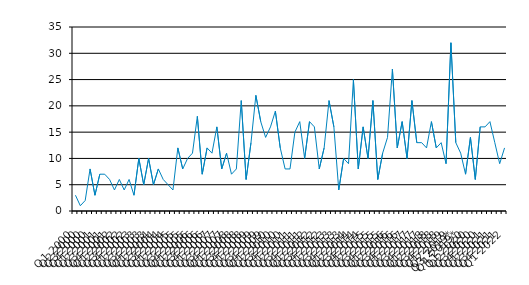
| Category | Series 0 |
|---|---|
| Q1 2000 | 3 |
| Q2 2000 | 1 |
| Q3 2000 | 2 |
| Q4 2000 | 8 |
| Q1 2001 | 3 |
| Q2 2001 | 7 |
| Q3 2001 | 7 |
| Q4 2001 | 6 |
| Q1 2002 | 4 |
| Q2 2002 | 6 |
| Q3 2002 | 4 |
| Q4 2002 | 6 |
| Q1 2003 | 3 |
| Q2 2003 | 10 |
| Q3 2003 | 5 |
| Q4 2003 | 10 |
| Q1 2004 | 5 |
| Q2 2004 | 8 |
| Q3 2004 | 6 |
| Q4 2004 | 5 |
| Q1 2005 | 4 |
| Q2 2005 | 12 |
| Q3 2005 | 8 |
| Q4 2005 | 10 |
| Q1 2006 | 11 |
| Q2 2006 | 18 |
| Q3 2006 | 7 |
| Q4 2006 | 12 |
| Q1 2007 | 11 |
| Q2 2007 | 16 |
| Q3 2007 | 8 |
| Q4 2007 | 11 |
| Q1 2008 | 7 |
| Q2 2008 | 8 |
| Q3 2008 | 21 |
| Q4 2008 | 6 |
| Q1 2009 | 13 |
| Q2 2009 | 22 |
| Q3 2009 | 17 |
| Q4 2009 | 14 |
| Q1 2010 | 16 |
| Q2 2010 | 19 |
| Q3 2010 | 12 |
| Q4 2010 | 8 |
| Q1 2011 | 8 |
| Q2 2011 | 15 |
| Q3 2011 | 17 |
| Q4 2011 | 10 |
| Q1 2012 | 17 |
| Q2 2012 | 16 |
| Q3 2012 | 8 |
| Q4 2012 | 12 |
| Q1 2013 | 21 |
| Q2 2013 | 16 |
| Q3 2013 | 4 |
| Q4 2013 | 10 |
| Q1 2014 | 9 |
| Q2 2014 | 25 |
| Q3 2014 | 8 |
| Q4 2014 | 16 |
| Q1 2015 | 10 |
| Q2 2015 | 21 |
| Q3 2015 | 6 |
| Q4 2015 | 11 |
| Q1 2016 | 14 |
| Q2 2016 | 27 |
| Q3 2016 | 12 |
| Q4 2016 | 17 |
| Q1 2017 | 10 |
| Q2 2017 | 21 |
| Q3 2017 | 13 |
| Q4 2017 | 13 |
| Q1 2018 | 12 |
| Q2 2018 | 17 |
| Q3 2018 | 12 |
| Q4 2018 | 13 |
| Q1 2019 | 9 |
| Q2 2019 | 32 |
| Q3 2019* | 13 |
| Q4 2019* | 11 |
| Q1 2020 | 7 |
| Q2 2020 | 14 |
| Q3 2020 | 6 |
| Q4 2020 | 16 |
| Q1 2021 | 16 |
| Q2 2021 | 17 |
| Q3 2021 | 13 |
| Q4 2021 | 9 |
| Q1 2022 | 12 |